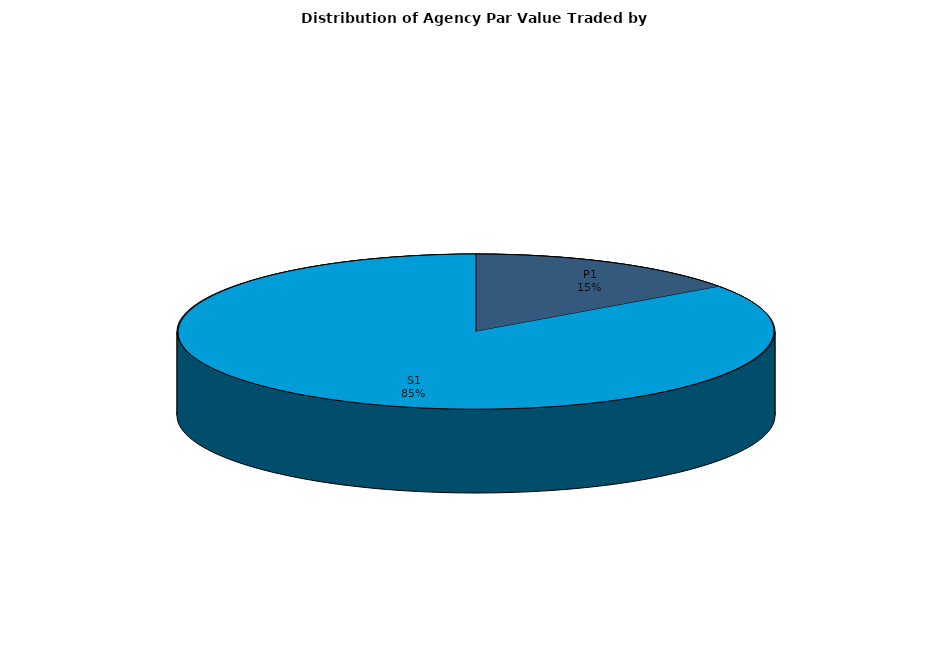
| Category | Series 0 |
|---|---|
| P1 | 963812357.143 |
| S1 | 5404152738.902 |